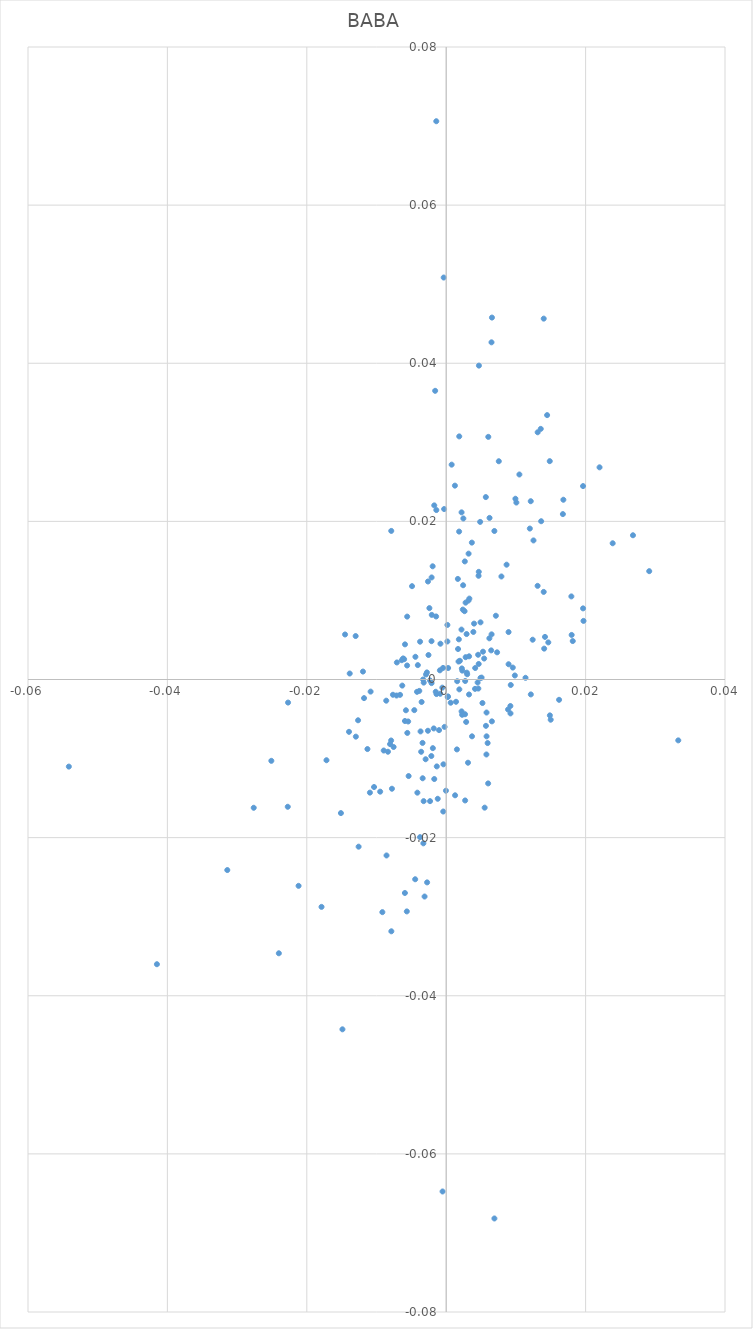
| Category | BABA |
|---|---|
| 0.00272413218390806 | 0 |
| 0.00185398838331881 | 0.019 |
| 0.00286408758107687 | -0.005 |
| 0.00153826826187221 | -0.009 |
| 0.00368006419633124 | 0.017 |
| 0.00416155213983746 | 0.001 |
| 0.00492012080759829 | 0 |
| 0.00292544314138434 | 0.006 |
| 0.00457941849518054 | 0.003 |
| -0.00213171546115889 | -0.01 |
| -0.000905994024526479 | 0.001 |
| -0.00805371928800704 | -0.008 |
| 0.0139893329600385 | 0.011 |
| -0.00557862475412414 | -0.007 |
| 0.00219387009399251 | 0.006 |
| -0.00374853349001181 | 0.005 |
| -0.000422835235790476 | -0.017 |
| 0.00246089577022866 | 0.02 |
| 0.00321307901312032 | 0.016 |
| 0.00520085622666984 | -0.003 |
| 0.00579226097484133 | -0.007 |
| -0.00322610133738443 | 0 |
| 0.00127539688655156 | -0.015 |
| 0.00492309530832401 | 0.007 |
| 0.00577064069048177 | -0.009 |
| 0.000216890392485077 | -0.002 |
| 0.000783889892644773 | 0.027 |
| 0.00926217113301866 | -0.001 |
| 0.00181677293955369 | 0.005 |
| 0.00228533104043544 | -0.004 |
| 0.00370445517521771 | -0.007 |
| -0.00603520158491278 | 0.003 |
| -0.00441840540510428 | 0.003 |
| -0.025087880042663 | -0.01 |
| -0.0139442592346206 | -0.007 |
| -0.00171242585992306 | -0.013 |
| 0.0104999031176095 | 0.026 |
| 0.00603961967513871 | 0.031 |
| 0.0196336625738341 | 0.024 |
| 0.00460956612085327 | -0.001 |
| -0.00560906237222115 | 0.002 |
| 0.00188528503918473 | -0.001 |
| -0.00418800393725667 | -0.002 |
| 0.00169972508614277 | 0.004 |
| -0.000397604422389445 | -0.011 |
| 0.00466093019865472 | 0.002 |
| -0.00141442371660457 | 0.021 |
| 0.0023872359126535 | 0.009 |
| 0.0149934831863057 | -0.005 |
| 0.00649937466111951 | 0.043 |
| -0.000297013647145189 | 0.022 |
| 0.0196353054001846 | 0.009 |
| -0.0129907245603905 | 0.005 |
| -0.00210050335619837 | 0 |
| -0.00661783863583866 | -0.002 |
| 0.00263679751379246 | 0.009 |
| -0.00232191114545667 | 0 |
| -0.00310270741537498 | -0.027 |
| -0.0036800784541696 | -0.007 |
| 0.00332309169230771 | 0.01 |
| 0.0032845659776212 | 0.003 |
| -0.00712314942566601 | -0.002 |
| -0.00273874354609882 | -0.026 |
| 0.00312751479819104 | -0.011 |
| 0.00920906396705334 | -0.003 |
| -0.00191486562112743 | -0.009 |
| 0.0179584608389324 | 0.011 |
| 0.00467486087352771 | 0.014 |
| 0.0196990107164486 | 0.007 |
| -0.00262133853668479 | -0.006 |
| 0.0179995664966245 | 0.006 |
| 0.000170090140526278 | 0.007 |
| -0.0148863070649694 | -0.044 |
| -0.0171767290302577 | -0.01 |
| 0.0046450376082552 | 0.013 |
| 0.0071261014604951 | 0.008 |
| 0.00157892169448004 | 0 |
| -0.00764331210191083 | -0.002 |
| 0.000254857292378061 | -0.002 |
| 0.0113793282343396 | 0 |
| -0.012961741057758 | -0.007 |
| 0.00792327131268174 | 0.013 |
| 0.0062180803548791 | 0.02 |
| 0.0291282797120631 | 0.014 |
| -0.0240104036281179 | -0.035 |
| -0.0109446208983605 | -0.014 |
| -0.031405613465967 | -0.024 |
| -0.00786959427250902 | -0.032 |
| 0.0124059581813986 | 0.005 |
| 0.0267956134209381 | 0.018 |
| -0.00139355654919261 | -0.002 |
| -0.00790185578033472 | -0.008 |
| -0.0211799143660901 | -0.026 |
| -0.00545751805040084 | -0.005 |
| -0.0117867807403649 | -0.002 |
| 0.00270388703112898 | -0.004 |
| -0.00577788607063528 | -0.004 |
| -0.00778469868253744 | -0.014 |
| -0.00860315658701464 | -0.003 |
| 0.0141737155405523 | 0.005 |
| 0.00295752709274531 | 0.001 |
| -0.00630112455840261 | -0.001 |
| 0.00651260157168796 | 0.006 |
| 0.0181572090002422 | 0.005 |
| 0.00278405551431435 | 0.01 |
| 0.000646650817091468 | -0.003 |
| -0.0094731300867702 | -0.014 |
| 0.00271750803633714 | -0.015 |
| -0.00564989633129224 | -0.029 |
| 0.0168100318844267 | 0.023 |
| -0.00295113182974396 | -0.01 |
| 0.00230899622602744 | 0.001 |
| -0.00194322057169486 | 0.014 |
| 0.00301103598908625 | 0.001 |
| -0.00457676418321207 | -0.004 |
| 0.0017691405530037 | 0.002 |
| -0.00915979435883711 | -0.029 |
| -0.000826393517604967 | 0.005 |
| 0.0100665990885212 | 0.022 |
| -0.0151050329681079 | -0.017 |
| -0.00121329736557444 | -0.015 |
| 0.0135646902682186 | 0.032 |
| 0.00656430494590407 | 0.046 |
| 0.00551932249237509 | -0.016 |
| -0.00323314923338141 | -0.015 |
| -0.00406875563992247 | 0.002 |
| 0.0136249243481664 | 0.02 |
| 0.00220617083880078 | 0.021 |
| -0.012643694338517 | -0.005 |
| 0.0131138738614518 | 0.012 |
| -0.0178865608552923 | -0.029 |
| -0.00637379554665036 | 0.002 |
| -3.71649207404671e-05 | -0.014 |
| 0.0139922761177625 | 0.046 |
| 0.00691176501657521 | 0.019 |
| 0.00196245875431926 | 0.002 |
| -0.00261390928936823 | 0.012 |
| -0.00490063577906509 | 0.012 |
| 0.00327782468300971 | -0.002 |
| 0.00242636551133121 | 0.012 |
| -0.00289817045054949 | 0.001 |
| -0.00375356318639926 | -0.02 |
| -0.000451703362293257 | 0.001 |
| -0.00337649211400513 | -0.012 |
| -0.00386169542198688 | -0.001 |
| -0.00331501956290548 | 0 |
| 0.00527962279788902 | 0.004 |
| -0.00591843251500622 | -0.005 |
| -0.00135055574773146 | -0.011 |
| -0.00142294479451212 | 0.071 |
| -0.000358666159861817 | 0.051 |
| 0.00125081738868632 | 0.025 |
| 0.00279423277310167 | 0.003 |
| -0.00210676640445562 | 0.005 |
| 0.0121417284415177 | -0.002 |
| -0.00209030070036438 | 0.013 |
| -0.00149979004086758 | -0.002 |
| -0.00102380577565413 | -0.006 |
| 0.0121312895499473 | 0.023 |
| 0.0332967709978418 | -0.008 |
| 0.00507901380276307 | 0 |
| 0.00570177108580142 | -0.006 |
| 0.00017161790654719 | 0.005 |
| -0.00231799722471032 | -0.015 |
| 0.00645545018530657 | 0.004 |
| -0.00352676591647506 | -0.003 |
| 0.00487124425150125 | 0.02 |
| 0.000278758625404829 | 0.001 |
| 0.0238842990097991 | 0.017 |
| -0.000231017943425139 | -0.006 |
| 0.00866371685758947 | 0.015 |
| -0.004136503199458 | -0.014 |
| 0.00730197732725003 | 0.003 |
| 0.0131237741639647 | 0.031 |
| 0.0148743303046358 | -0.005 |
| -0.0024118948191672 | 0.009 |
| 0.00578807461189536 | -0.004 |
| -0.00754661738824365 | -0.009 |
| 0.00955178986396895 | 0.002 |
| 0.0119967591248528 | 0.019 |
| 0.00568525872052122 | 0.023 |
| 0.0148574372040087 | 0.028 |
| -0.00592527280924809 | -0.027 |
| -0.041504026197099 | -0.036 |
| 0.00619311748504572 | 0.005 |
| 0.00224292685473616 | 0.001 |
| 0.00389446699690944 | 0.006 |
| 0.00266951366702163 | 0.015 |
| -0.0276147739040387 | -0.016 |
| -0.0108441824913092 | -0.002 |
| -0.00144561609273774 | 0.008 |
| 0.00187188472241432 | 0.031 |
| -0.00178670876093052 | -0.006 |
| -0.0125653420092296 | -0.021 |
| -0.000551832613924261 | -0.001 |
| 0.016194949408057 | -0.003 |
| 0.00141088267104317 | -0.003 |
| -0.00788191655780834 | 0.019 |
| -0.0112997094790947 | -0.009 |
| -0.00559816406600263 | 0.008 |
| -0.000520737146955572 | -0.065 |
| 0.00167201717513164 | 0.013 |
| 0.014478964218247 | 0.033 |
| -0.00158512808297395 | 0.037 |
| 0.00691642470215904 | -0.068 |
| 0.0220007375392123 | 0.027 |
| -0.0061797977914182 | 0.003 |
| 0.00894720333546915 | 0.006 |
| -0.00896399282335929 | -0.009 |
| 0.0022077882164212 | -0.004 |
| -0.01384360696443 | 0.001 |
| 0.00754655694674409 | 0.028 |
| -0.00445010777651775 | -0.025 |
| -0.0033946766692712 | -0.008 |
| -0.0119424611705587 | 0.001 |
| 0.0140578496697581 | 0.004 |
| 0.00544694012262969 | 0.003 |
| 0.0146492572899726 | 0.005 |
| 0.00469520365418275 | 0.04 |
| 0.00413583788567598 | -0.001 |
| -0.0083565056838869 | -0.009 |
| 0.00922468208435984 | -0.004 |
| 0.00399966954301672 | 0.007 |
| -0.0227317155488901 | -0.016 |
| -0.00539031532452626 | -0.012 |
| -0.022689032081003 | -0.003 |
| 0.00601813828108648 | -0.013 |
| -0.0541409999999999 | -0.011 |
| 0.00655553748960426 | -0.005 |
| -0.00171338743961352 | 0.022 |
| -0.0145109601634886 | 0.006 |
| 0.00984614487179483 | 0.001 |
| 0.0059453757603521 | -0.008 |
| 0.00450835216764314 | 0 |
| 0.00993035107087024 | 0.023 |
| 0.00895006098278817 | 0.002 |
| -0.00254123674891152 | 0.003 |
| -0.000855159717249683 | -0.002 |
| -0.0103506346134409 | -0.014 |
| 0.0125235639589425 | 0.018 |
| -0.0085607330128655 | -0.022 |
| -0.00591160900190645 | 0.004 |
| 0.00887397927254485 | -0.004 |
| -0.00708020252600992 | 0.002 |
| 0.00319890839678856 | 0.01 |
| 0.0167401039647102 | 0.021 |
| -0.00206666041041826 | 0.008 |
| -0.00359043641055607 | -0.009 |
| -0.00327608715125726 | -0.021 |
| -0.00276842798723051 | 0.001 |